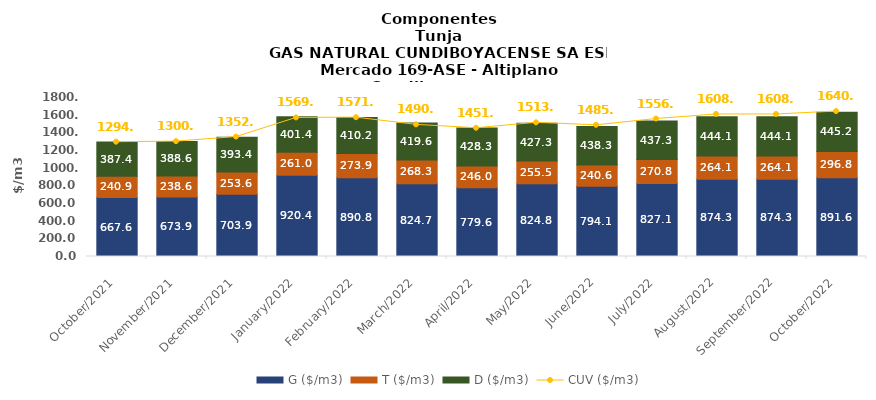
| Category | G ($/m3) | T ($/m3) | D ($/m3) |
|---|---|---|---|
| 2021-10-01 | 667.56 | 240.93 | 387.43 |
| 2021-11-01 | 673.86 | 238.56 | 388.58 |
| 2021-12-01 | 703.86 | 253.6 | 393.37 |
| 2022-01-01 | 920.37 | 261.03 | 401.37 |
| 2022-02-01 | 890.8 | 273.9 | 410.23 |
| 2022-03-01 | 824.74 | 268.34 | 419.57 |
| 2022-04-01 | 779.6 | 246.02 | 428.28 |
| 2022-05-01 | 824.78 | 255.51 | 427.34 |
| 2022-06-01 | 794.08 | 240.57 | 438.25 |
| 2022-07-01 | 827.1 | 270.77 | 437.28 |
| 2022-08-01 | 874.34 | 264.11 | 444.06 |
| 2022-09-01 | 874.34 | 264.11 | 444.06 |
| 2022-10-01 | 891.55 | 296.77 | 445.21 |